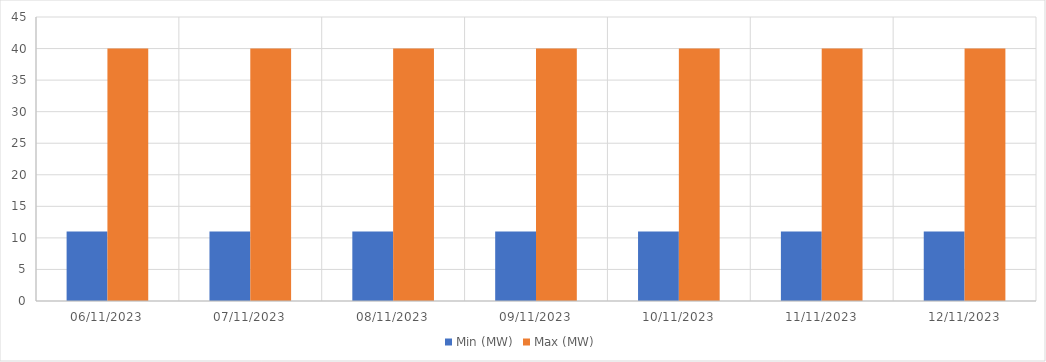
| Category | Min (MW) | Max (MW) |
|---|---|---|
| 06/11/2023 | 11 | 40 |
| 07/11/2023 | 11 | 40 |
| 08/11/2023 | 11 | 40 |
| 09/11/2023 | 11 | 40 |
| 10/11/2023 | 11 | 40 |
| 11/11/2023 | 11 | 40 |
| 12/11/2023 | 11 | 40 |